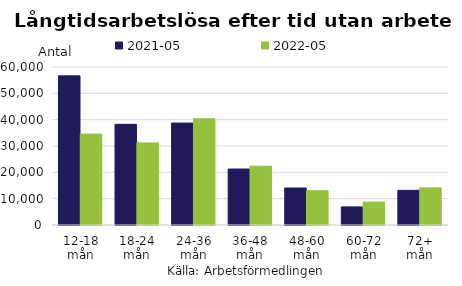
| Category | 2021-05 | 2022-05 |
|---|---|---|
| 12-18 mån | 56636 | 34520 |
| 18-24 mån | 38220 | 31186 |
| 24-36 mån | 38702 | 40354 |
| 36-48 mån | 21252 | 22324 |
| 48-60 mån | 14054 | 13006 |
| 60-72 mån | 6865 | 8716 |
| 72+ mån | 13163 | 14082 |